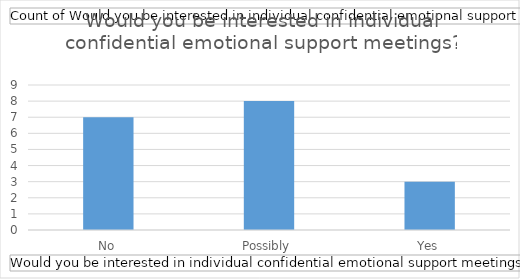
| Category | Total |
|---|---|
| No | 7 |
| Possibly | 8 |
| Yes | 3 |